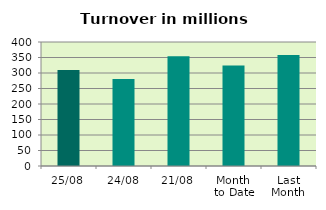
| Category | Series 0 |
|---|---|
| 25/08 | 309.536 |
| 24/08 | 280.765 |
| 21/08 | 354.239 |
| Month 
to Date | 324.219 |
| Last
Month | 357.784 |